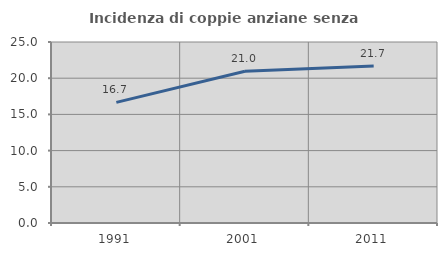
| Category | Incidenza di coppie anziane senza figli  |
|---|---|
| 1991.0 | 16.667 |
| 2001.0 | 20.952 |
| 2011.0 | 21.693 |